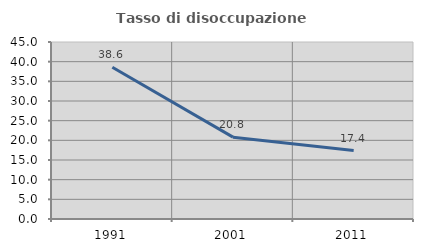
| Category | Tasso di disoccupazione giovanile  |
|---|---|
| 1991.0 | 38.585 |
| 2001.0 | 20.809 |
| 2011.0 | 17.391 |